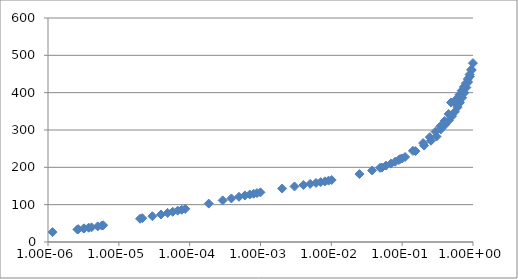
| Category | Series 0 |
|---|---|
| 1.15917e-06 | 26.53 |
| 2.60264e-06 | 33.628 |
| 2.67173e-06 | 34.263 |
| 3.19204e-06 | 35.938 |
| 3.22915e-06 | 36.543 |
| 3.74823e-06 | 38.257 |
| 4.11121e-06 | 39.294 |
| 5.03611e-06 | 41.897 |
| 5.73278e-06 | 43.954 |
| 6.02206e-06 | 44.8 |
| 1.99043e-05 | 62.256 |
| 2.14308e-05 | 63.838 |
| 2.98085e-05 | 69.001 |
| 3.93936e-05 | 73.625 |
| 4.88676e-05 | 77.969 |
| 5.76677e-05 | 80.993 |
| 6.77549e-05 | 83.964 |
| 7.73194e-05 | 86.36 |
| 8.67527e-05 | 88.708 |
| 0.000186008 | 102.829 |
| 0.000292198 | 111.444 |
| 0.000387888 | 116.714 |
| 0.000496812 | 121.125 |
| 0.000602133 | 124.563 |
| 0.000705904 | 127.24 |
| 0.000800887 | 129.31 |
| 0.000892099 | 131.005 |
| 0.000997441 | 133.003 |
| 0.00202006 | 143.167 |
| 0.00301989 | 148.704 |
| 0.00403016 | 152.61 |
| 0.00502768 | 155.622 |
| 0.00608053 | 158.25 |
| 0.00706257 | 160.358 |
| 0.00811145 | 162.368 |
| 0.009135 | 164.433 |
| 0.0101209 | 166.06 |
| 0.024946 | 181.917 |
| 0.0376401 | 191.545 |
| 0.0487051 | 198.714 |
| 0.0591987 | 204.679 |
| 0.0694479 | 210 |
| 0.0796357 | 214.925 |
| 0.0897549 | 219.515 |
| 0.0999124 | 223.706 |
| 0.109954 | 227.711 |
| 0.153872 | 243.404 |
| 0.20408 | 258.274 |
| 0.254953 | 271.16 |
| 0.305512 | 282.583 |
| 0.351651 | 301.663 |
| 0.405038 | 314.26 |
| 0.455516 | 325.577 |
| 0.505615 | 336.971 |
| 0.555331 | 348.755 |
| 0.605119 | 360.959 |
| 0.655055 | 373.376 |
| 0.704739 | 386.407 |
| 0.754676 | 399.693 |
| 0.804337 | 413.8 |
| 0.85396 | 428.393 |
| 0.903731 | 443.569 |
| 0.953063 | 460.076 |
| 0.996912 | 479.134 |
| 0.946889 | 462.145 |
| 0.895245 | 448.703 |
| 0.844619 | 436.621 |
| 0.794276 | 425.507 |
| 0.743966 | 415.41 |
| 0.693819 | 405.4 |
| 0.644144 | 394.621 |
| 0.594001 | 384.531 |
| 0.543975 | 374.214 |
| 0.48925 | 373.714 |
| 0.452913 | 342.999 |
| 0.397678 | 324.294 |
| 0.345701 | 309.886 |
| 0.295615 | 295.685 |
| 0.245892 | 280.845 |
| 0.197826 | 264.984 |
| 0.14178 | 244.209 |
| 0.0935753 | 222.33 |
| 0.0516999 | 199.236 |